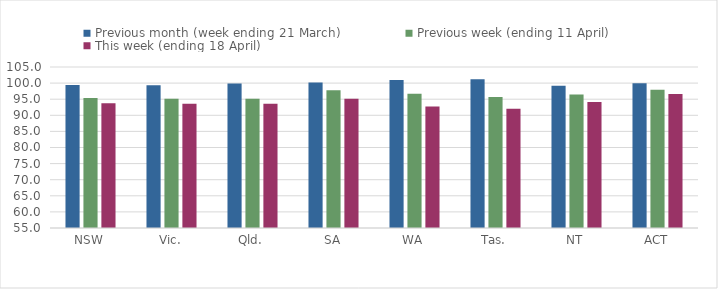
| Category | Previous month (week ending 21 March) | Previous week (ending 11 April) | This week (ending 18 April) |
|---|---|---|---|
| NSW | 99.445 | 95.379 | 93.751 |
| Vic. | 99.36 | 95.162 | 93.591 |
| Qld. | 99.862 | 95.105 | 93.6 |
| SA | 100.151 | 97.791 | 95.157 |
| WA | 100.98 | 96.709 | 92.697 |
| Tas. | 101.186 | 95.686 | 92.046 |
| NT | 99.144 | 96.49 | 94.133 |
| ACT | 99.925 | 97.911 | 96.615 |